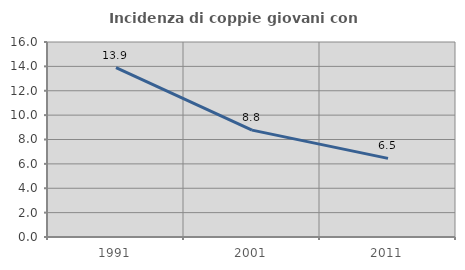
| Category | Incidenza di coppie giovani con figli |
|---|---|
| 1991.0 | 13.903 |
| 2001.0 | 8.771 |
| 2011.0 | 6.453 |